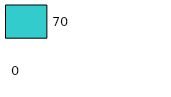
| Category | Series 0 | Series 1 |
|---|---|---|
| 0 | 0 | 70 |